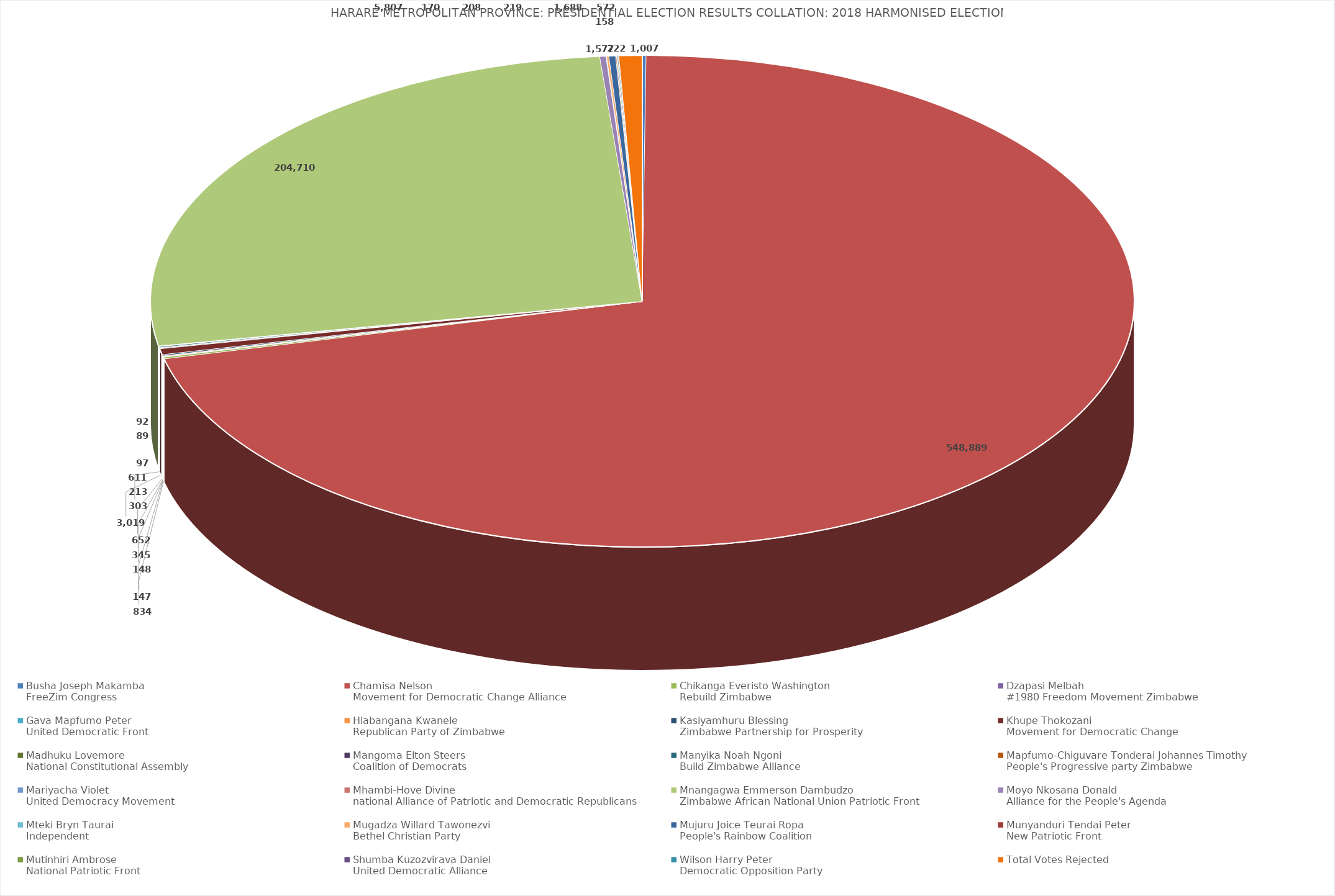
| Category | Series 0 |
|---|---|
| Busha Joseph Makamba
FreeZim Congress | 1007 |
| Chamisa Nelson
Movement for Democratic Change Alliance | 548889 |
| Chikanga Everisto Washington
Rebuild Zimbabwe | 834 |
| Dzapasi Melbah
#1980 Freedom Movement Zimbabwe | 147 |
| Gava Mapfumo Peter
United Democratic Front | 148 |
| Hlabangana Kwanele
Republican Party of Zimbabwe | 345 |
| Kasiyamhuru Blessing
Zimbabwe Partnership for Prosperity | 652 |
| Khupe Thokozani
Movement for Democratic Change | 3019 |
| Madhuku Lovemore
National Constitutional Assembly | 303 |
| Mangoma Elton Steers
Coalition of Democrats | 213 |
| Manyika Noah Ngoni
Build Zimbabwe Alliance | 611 |
| Mapfumo-Chiguvare Tonderai Johannes Timothy
People's Progressive party Zimbabwe | 97 |
| Mariyacha Violet
United Democracy Movement | 89 |
| Mhambi-Hove Divine
national Alliance of Patriotic and Democratic Republicans | 92 |
| Mnangagwa Emmerson Dambudzo
Zimbabwe African National Union Patriotic Front | 204710 |
| Moyo Nkosana Donald
Alliance for the People's Agenda | 1577 |
| Mteki Bryn Taurai
Independent | 158 |
| Mugadza Willard Tawonezvi
Bethel Christian Party | 572 |
| Mujuru Joice Teurai Ropa
People's Rainbow Coalition | 1688 |
| Munyanduri Tendai Peter
New Patriotic Front | 219 |
| Mutinhiri Ambrose
National Patriotic Front | 208 |
| Shumba Kuzozvirava Daniel
United Democratic Alliance | 222 |
| Wilson Harry Peter
Democratic Opposition Party | 170 |
| Total Votes Rejected  | 5807 |